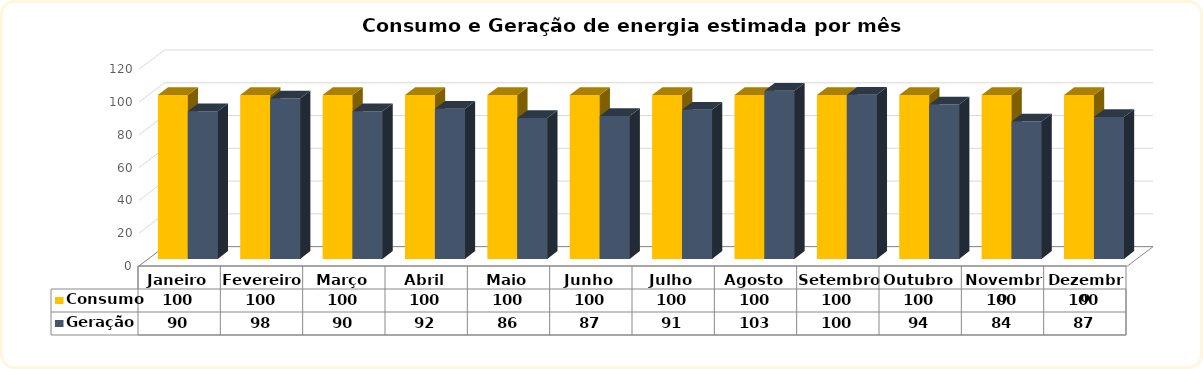
| Category | Consumo | Geração |
|---|---|---|
| Janeiro | 100 | 90.117 |
| Fevereiro | 100 | 97.812 |
| Março | 100 | 90.117 |
| Abril | 100 | 91.656 |
| Maio | 100 | 86.013 |
| Junho | 100 | 87.21 |
| Julho | 100 | 90.972 |
| Agosto | 100 | 102.6 |
| Setembro | 100 | 100.206 |
| Outubro | 100 | 94.221 |
| Novembro | 100 | 83.79 |
| Dezembro | 100 | 86.526 |